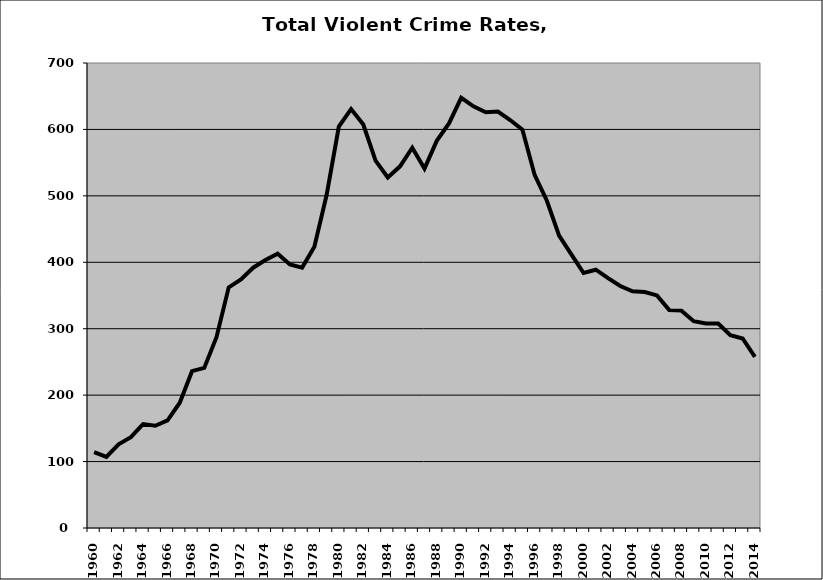
| Category | VCR |
|---|---|
| 1960.0 | 114.262 |
| 1961.0 | 107.015 |
| 1962.0 | 126.085 |
| 1963.0 | 136.77 |
| 1964.0 | 156.48 |
| 1965.0 | 153.853 |
| 1966.0 | 161.902 |
| 1967.0 | 188.548 |
| 1968.0 | 236.098 |
| 1969.0 | 240.99 |
| 1970.0 | 287.145 |
| 1971.0 | 362.205 |
| 1972.0 | 374.331 |
| 1973.0 | 391.863 |
| 1974.0 | 403.383 |
| 1975.0 | 412.999 |
| 1976.0 | 396.769 |
| 1977.0 | 392.032 |
| 1978.0 | 423.461 |
| 1979.0 | 501.187 |
| 1980.0 | 604.359 |
| 1981.0 | 630.645 |
| 1982.0 | 607.354 |
| 1983.0 | 553.08 |
| 1984.0 | 527.731 |
| 1985.0 | 544.459 |
| 1986.0 | 572.48 |
| 1987.0 | 541.019 |
| 1988.0 | 582.811 |
| 1989.0 | 608.984 |
| 1990.0 | 647.552 |
| 1991.0 | 634.755 |
| 1992.0 | 625.818 |
| 1993.0 | 626.856 |
| 1994.0 | 614.17 |
| 1995.0 | 599.773 |
| 1996.0 | 531.535 |
| 1997.0 | 492.649 |
| 1998.0 | 440.173 |
| 1999.0 | 411.867 |
| 2000.0 | 383.844 |
| 2001.0 | 388.833 |
| 2002.0 | 376.106 |
| 2003.0 | 364.343 |
| 2004.0 | 356.274 |
| 2005.0 | 355.262 |
| 2006.0 | 350.104 |
| 2007.0 | 327.945 |
| 2008.0 | 327.25 |
| 2009.0 | 311.367 |
| 2010.0 | 307.727 |
| 2011.0 | 307.908 |
| 2012.0 | 290.119 |
| 2013.0 | 285.249 |
| 2014.0 | 257.603 |